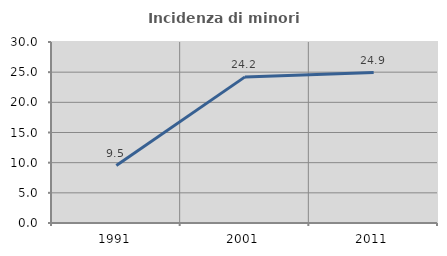
| Category | Incidenza di minori stranieri |
|---|---|
| 1991.0 | 9.524 |
| 2001.0 | 24.219 |
| 2011.0 | 24.932 |